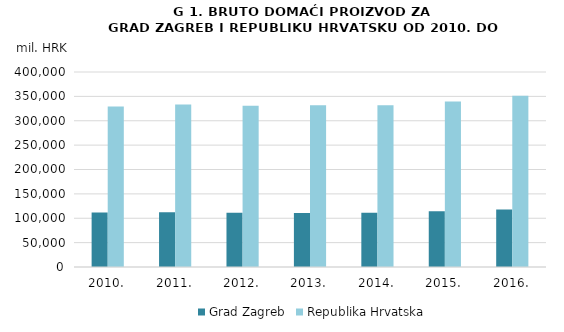
| Category | Grad Zagreb | Republika Hrvatska |
|---|---|---|
| 2010. | 111724 | 329143 |
| 2011. | 112383 | 333457 |
| 2012. | 111488 | 330825 |
| 2013. | 110779 | 331785 |
| 2014. | 111505 | 331570 |
| 2015. | 114356 | 339615 |
| 2016. | 118100 | 351349 |